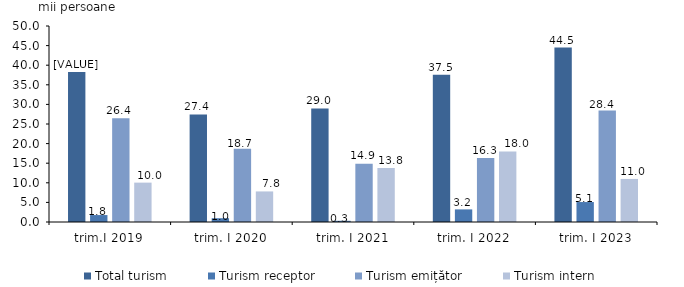
| Category | Total turism | Turism receptor | Turism emițător | Turism intern |
|---|---|---|---|---|
| trim.I 2019 | 38.249 | 1.77 | 26.435 | 10.044 |
| trim. I 2020 | 27.432 | 0.967 | 18.667 | 7.798 |
| trim. I 2021 | 28.958 | 0.306 | 14.856 | 13.796 |
| trim. I 2022 | 37.532 | 3.217 | 16.327 | 17.989 |
| trim. I 2023 | 44.513 | 5.09 | 28.437 | 10.986 |